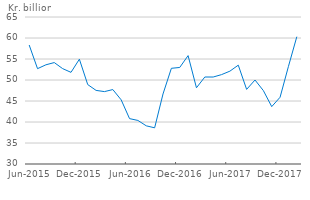
| Category | Interest rate sensitivity per percentage point |
|---|---|
| 2015-06-01 | 58.331 |
| 2015-07-01 | 52.7 |
| 2015-08-01 | 53.619 |
| 2015-09-01 | 54.151 |
| 2015-10-01 | 52.712 |
| 2015-11-01 | 51.822 |
| 2015-12-01 | 54.959 |
| 2016-01-01 | 48.911 |
| 2016-02-01 | 47.525 |
| 2016-03-01 | 47.237 |
| 2016-04-01 | 47.723 |
| 2016-05-01 | 45.275 |
| 2016-06-01 | 40.806 |
| 2016-07-01 | 40.371 |
| 2016-08-01 | 39.092 |
| 2016-09-01 | 38.616 |
| 2016-10-01 | 46.673 |
| 2016-11-01 | 52.784 |
| 2016-12-01 | 52.985 |
| 2017-01-01 | 55.804 |
| 2017-02-01 | 48.145 |
| 2017-03-01 | 50.714 |
| 2017-04-01 | 50.709 |
| 2017-05-01 | 51.282 |
| 2017-06-01 | 52.107 |
| 2017-07-01 | 53.532 |
| 2017-08-01 | 47.767 |
| 2017-09-01 | 50 |
| 2017-10-01 | 47.475 |
| 2017-11-01 | 43.663 |
| 2017-12-01 | 45.896 |
| 2018-01-01 | 53.248 |
| 2018-02-01 | 60.311 |